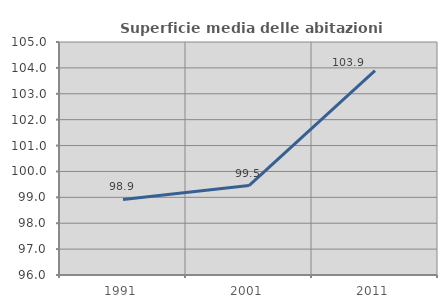
| Category | Superficie media delle abitazioni occupate |
|---|---|
| 1991.0 | 98.919 |
| 2001.0 | 99.453 |
| 2011.0 | 103.896 |